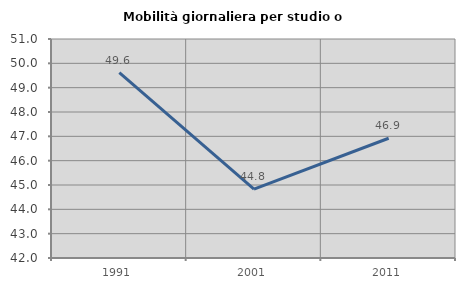
| Category | Mobilità giornaliera per studio o lavoro |
|---|---|
| 1991.0 | 49.622 |
| 2001.0 | 44.834 |
| 2011.0 | 46.92 |